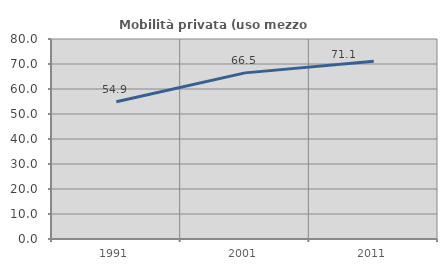
| Category | Mobilità privata (uso mezzo privato) |
|---|---|
| 1991.0 | 54.886 |
| 2001.0 | 66.451 |
| 2011.0 | 71.059 |